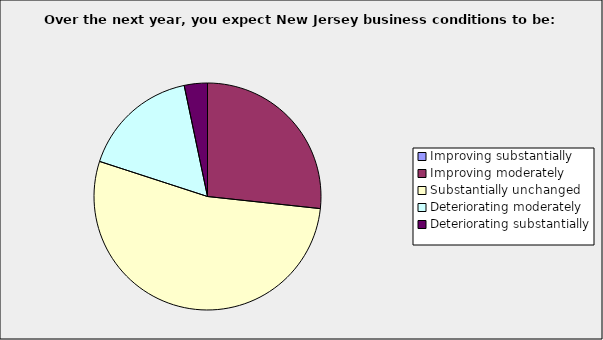
| Category | Series 0 |
|---|---|
| Improving substantially | 0 |
| Improving moderately | 0.267 |
| Substantially unchanged | 0.533 |
| Deteriorating moderately | 0.167 |
| Deteriorating substantially | 0.033 |